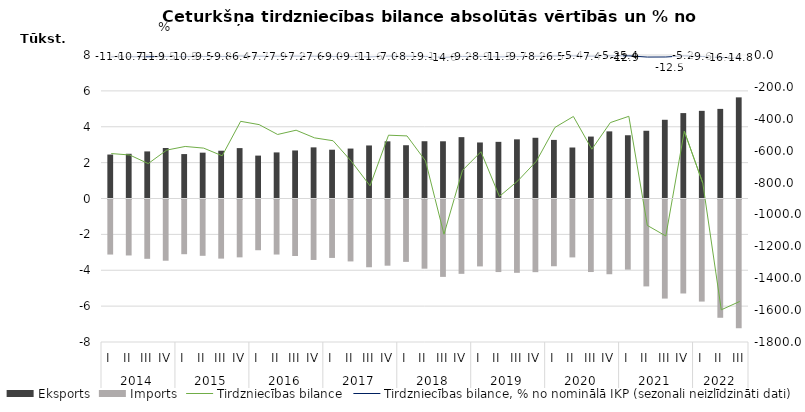
| Category | Eksports | Imports |
|---|---|---|
| 0 | 2450.7 | -3068.8 |
| 1 | 2493.4 | -3120.5 |
| 2 | 2625.5 | -3306.5 |
| 3 | 2816.7 | -3413.2 |
| 4 | 2476.5 | -3050.1 |
| 5 | 2555.2 | -3139.2 |
| 6 | 2663.4 | -3295.5 |
| 7 | 2809.5 | -3225.4 |
| 8 | 2391.5 | -2828.1 |
| 9 | 2569.5 | -3068 |
| 10 | 2678.2 | -3149.9 |
| 11 | 2850.8 | -3370.5 |
| 12 | 2719.6 | -3257.4 |
| 13 | 2783.8 | -3452 |
| 14 | 2956.9 | -3777.4 |
| 15 | 3187 | -3690 |
| 16 | 2969.9 | -3477.4 |
| 17 | 3193.3 | -3857.4 |
| 18 | 3189.7 | -4313.9 |
| 19 | 3420.5 | -4144.2 |
| 20 | 3123.6 | -3730.2 |
| 21 | 3158.2 | -4044.8 |
| 22 | 3298.5 | -4087.5 |
| 23 | 3385.3 | -4051.1 |
| 24 | 3266.4 | -3720.9 |
| 25 | 2842.7 | -3228.3 |
| 26 | 3452.8 | -4043.7 |
| 27 | 3742.7 | -4166.6 |
| 28 | 3526.2 | -3910.7 |
| 29 | 3776 | -4844.9 |
| 30 | 4388.7 | -5523.8 |
| 31 | 4761.5 | -5239.5 |
| 32 | 4886.7 | -5690.3 |
| 33 | 4995.8 | -6594 |
| 34 | 5638.3 | -7183.9 |